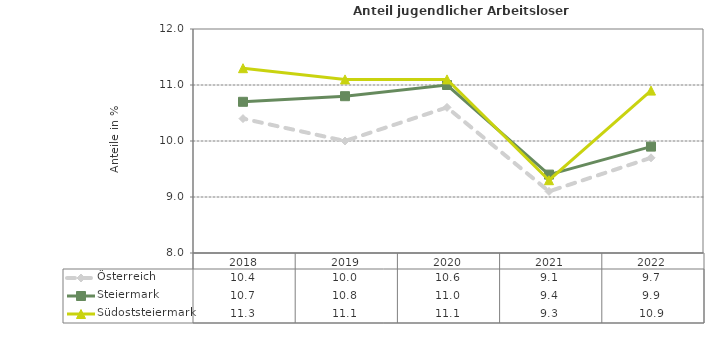
| Category | Österreich | Steiermark | Südoststeiermark |
|---|---|---|---|
| 2022.0 | 9.7 | 9.9 | 10.9 |
| 2021.0 | 9.1 | 9.4 | 9.3 |
| 2020.0 | 10.6 | 11 | 11.1 |
| 2019.0 | 10 | 10.8 | 11.1 |
| 2018.0 | 10.4 | 10.7 | 11.3 |